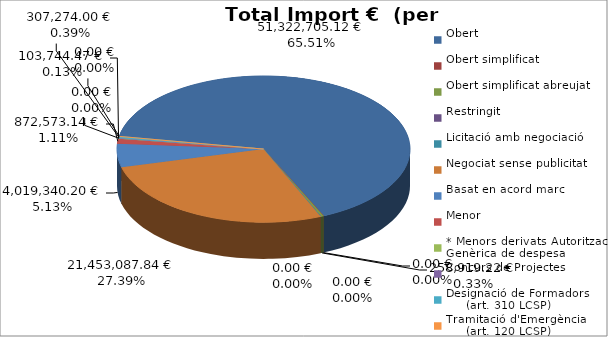
| Category | Total preu
(amb IVA) |
|---|---|
| Obert | 51322705.12 |
| Obert simplificat | 0 |
| Obert simplificat abreujat | 258919.22 |
| Restringit | 0 |
| Licitació amb negociació | 0 |
| Negociat sense publicitat | 21453087.84 |
| Basat en acord marc | 4019340.2 |
| Menor | 872573.14 |
| * Menors derivats Autorització Genèrica de despesa | 103744.47 |
| Concurs de Projectes | 0 |
| Designació de Formadors
     (art. 310 LCSP) | 307274 |
| Tramitació d'Emergència
     (art. 120 LCSP) | 0 |